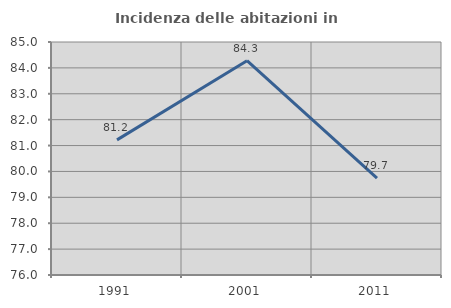
| Category | Incidenza delle abitazioni in proprietà  |
|---|---|
| 1991.0 | 81.218 |
| 2001.0 | 84.277 |
| 2011.0 | 79.739 |